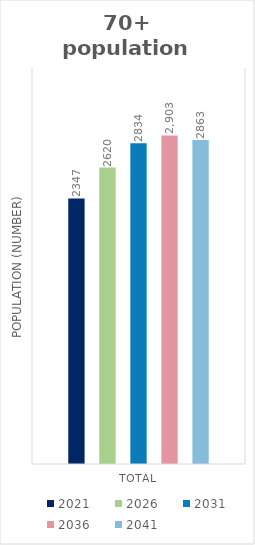
| Category | 2021 | 2026 | 2031 | 2036 | 2041 |
|---|---|---|---|---|---|
| Total | 2346.63 | 2620.099 | 2834.319 | 2902.516 | 2863.435 |